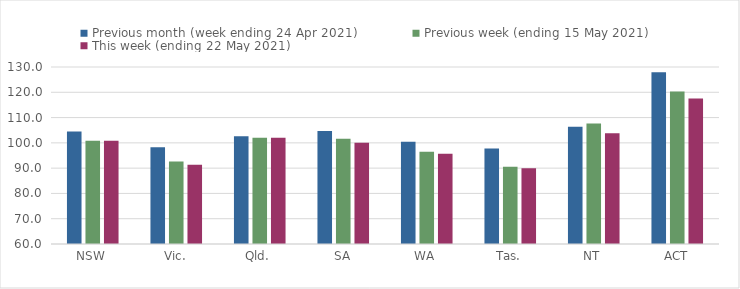
| Category | Previous month (week ending 24 Apr 2021) | Previous week (ending 15 May 2021) | This week (ending 22 May 2021) |
|---|---|---|---|
| NSW | 104.5 | 100.85 | 100.84 |
| Vic. | 98.26 | 92.58 | 91.34 |
| Qld. | 102.57 | 102 | 102.04 |
| SA | 104.66 | 101.64 | 100.05 |
| WA | 100.45 | 96.46 | 95.7 |
| Tas. | 97.77 | 90.58 | 89.98 |
| NT | 106.41 | 107.69 | 103.83 |
| ACT | 127.97 | 120.34 | 117.56 |